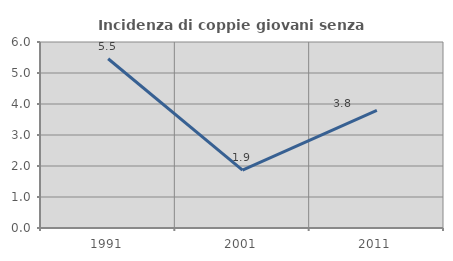
| Category | Incidenza di coppie giovani senza figli |
|---|---|
| 1991.0 | 5.46 |
| 2001.0 | 1.869 |
| 2011.0 | 3.793 |